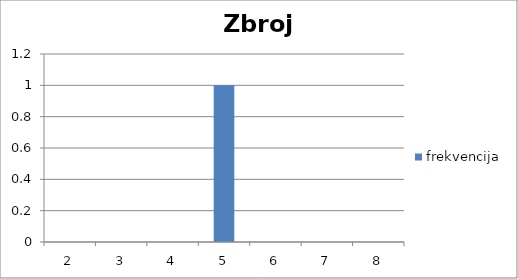
| Category | frekvencija |
|---|---|
| 2.0 | 0 |
| 3.0 | 0 |
| 4.0 | 0 |
| 5.0 | 1 |
| 6.0 | 0 |
| 7.0 | 0 |
| 8.0 | 0 |